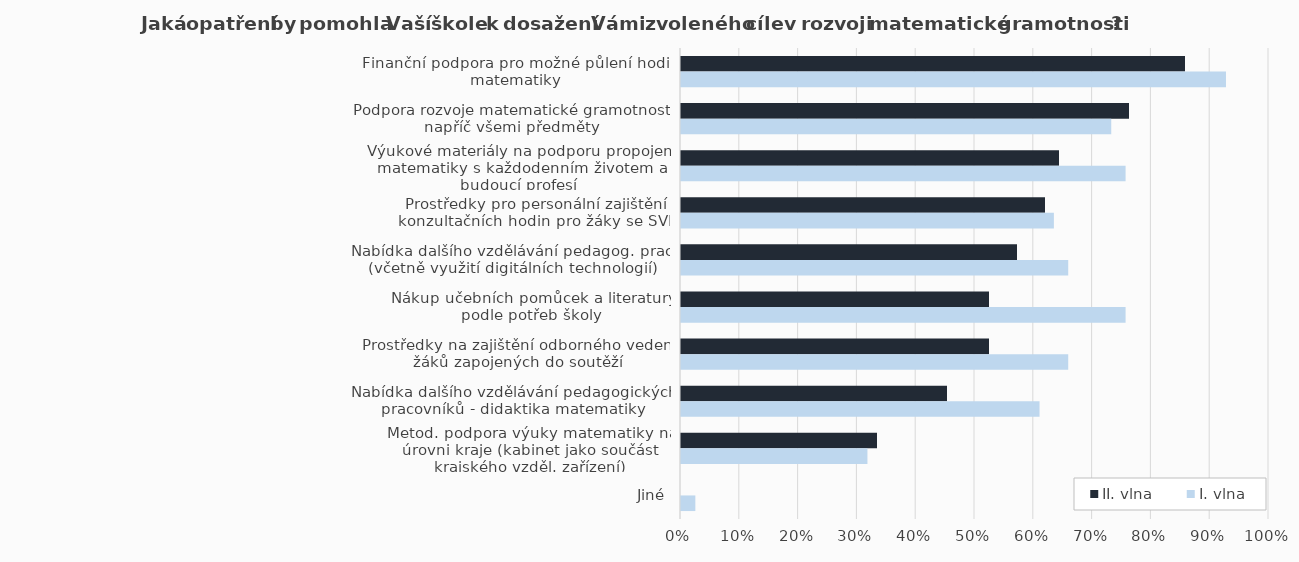
| Category | II. vlna | I. vlna |
|---|---|---|
| Finanční podpora pro možné půlení hodin matematiky | 0.857 | 0.927 |
| Podpora rozvoje matematické gramotnosti napříč všemi předměty | 0.762 | 0.732 |
| Výukové materiály na podporu propojení matematiky s každodenním životem a budoucí profesí | 0.643 | 0.756 |
| Prostředky pro personální zajištění konzultačních hodin pro žáky se SVP | 0.619 | 0.634 |
| Nabídka dalšího vzdělávání pedagog. prac. (včetně využití digitálních technologií) | 0.571 | 0.659 |
| Nákup učebních pomůcek a literatury podle potřeb školy | 0.524 | 0.756 |
| Prostředky na zajištění odborného vedení žáků zapojených do soutěží | 0.524 | 0.659 |
| Nabídka dalšího vzdělávání pedagogických pracovníků - didaktika matematiky | 0.452 | 0.61 |
| Metod. podpora výuky matematiky na úrovni kraje (kabinet jako součást krajského vzděl. zařízení) | 0.333 | 0.317 |
| Jiné | 0 | 0.024 |